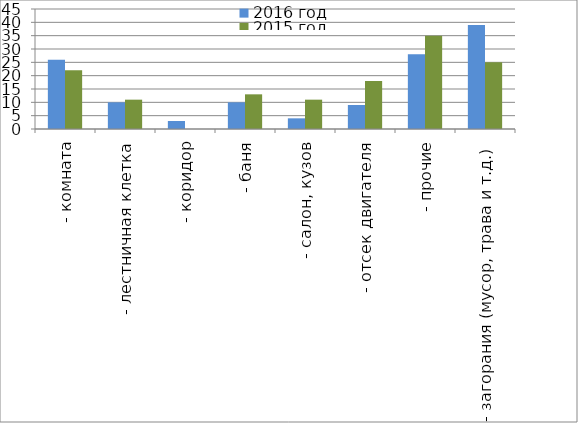
| Category | 2016 год | 2015 год |
|---|---|---|
|  - комната | 26 | 22 |
|  - лестничная клетка | 10 | 11 |
|  - коридор | 3 | 0 |
|  - баня | 10 | 13 |
|  - салон, кузов | 4 | 11 |
|  - отсек двигателя | 9 | 18 |
| - прочие | 28 | 35 |
| - загорания (мусор, трава и т.д.)  | 39 | 25 |